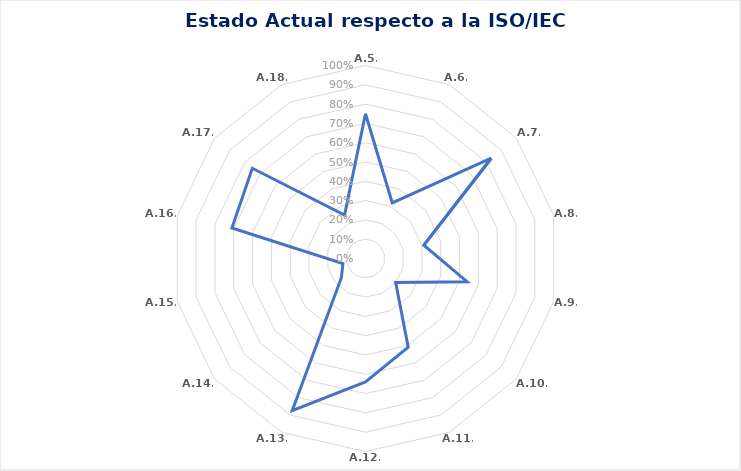
| Category | Series 0 |
|---|---|
| A.5. | 0.75 |
| A.6. | 0.32 |
| A.7. | 0.833 |
| A.8. | 0.31 |
| A.9. | 0.54 |
| A.10. | 0.2 |
| A.11. | 0.51 |
| A.12. | 0.64 |
| A.13. | 0.875 |
| A.14. | 0.16 |
| A.15. | 0.12 |
| A.16. | 0.71 |
| A.17. | 0.75 |
| A.18. | 0.25 |